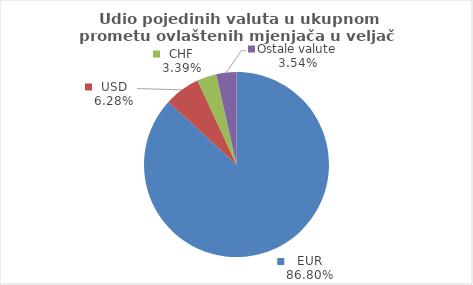
| Category | Series 0 |
|---|---|
| EUR | 86.802 |
| USD | 6.282 |
| CHF | 3.382 |
| Ostale valute | 3.533 |